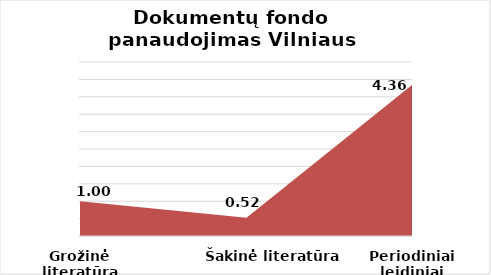
| Category | Series 0 |
|---|---|
| Grožinė literatūra | 1 |
| Šakinė literatūra | 0.523 |
| Periodiniai leidiniai | 4.36 |